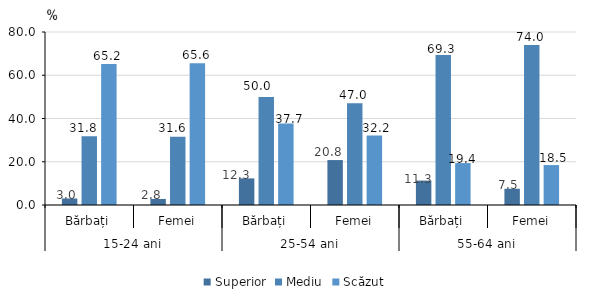
| Category | Superior | Mediu | Scăzut |
|---|---|---|---|
| 0 | 3 | 31.8 | 65.2 |
| 1 | 2.792 | 31.605 | 65.602 |
| 2 | 12.3 | 50 | 37.7 |
| 3 | 20.782 | 47.042 | 32.176 |
| 4 | 11.277 | 69.349 | 19.374 |
| 5 | 7.498 | 74.04 | 18.462 |